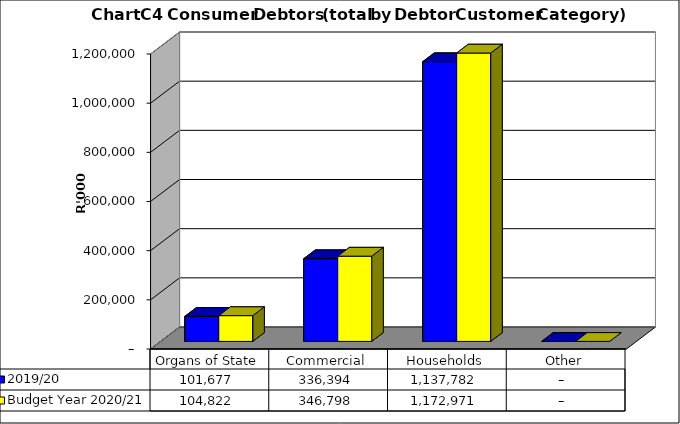
| Category |  2019/20  | Budget Year 2020/21 |
|---|---|---|
| Organs of State | 101677038.33 | 104821689 |
| Commercial | 336393961.06 | 346797898 |
| Households | 1137782213.38 | 1172971354 |
| Other | 0 | 0 |